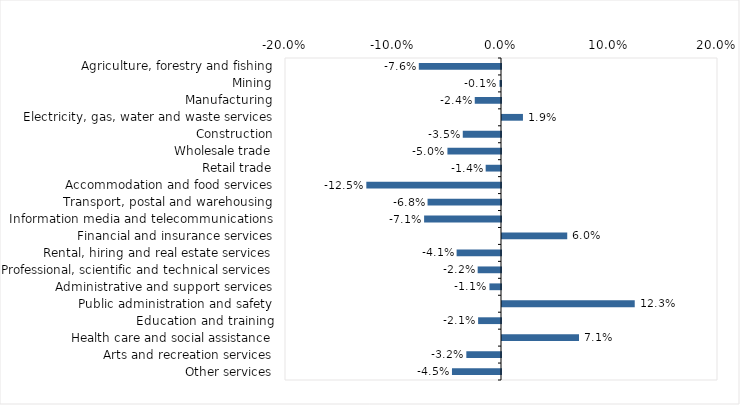
| Category | This week |
|---|---|
| Agriculture, forestry and fishing | -0.076 |
| Mining | -0.001 |
| Manufacturing | -0.024 |
| Electricity, gas, water and waste services | 0.019 |
| Construction | -0.035 |
| Wholesale trade | -0.05 |
| Retail trade | -0.014 |
| Accommodation and food services | -0.125 |
| Transport, postal and warehousing | -0.068 |
| Information media and telecommunications | -0.071 |
| Financial and insurance services | 0.06 |
| Rental, hiring and real estate services | -0.041 |
| Professional, scientific and technical services | -0.022 |
| Administrative and support services | -0.011 |
| Public administration and safety | 0.123 |
| Education and training | -0.021 |
| Health care and social assistance | 0.071 |
| Arts and recreation services | -0.032 |
| Other services | -0.045 |